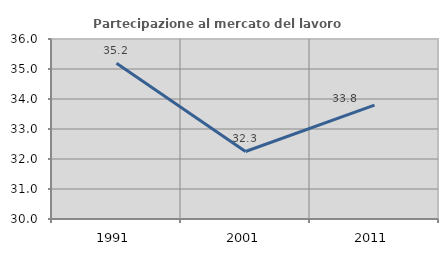
| Category | Partecipazione al mercato del lavoro  femminile |
|---|---|
| 1991.0 | 35.188 |
| 2001.0 | 32.251 |
| 2011.0 | 33.795 |